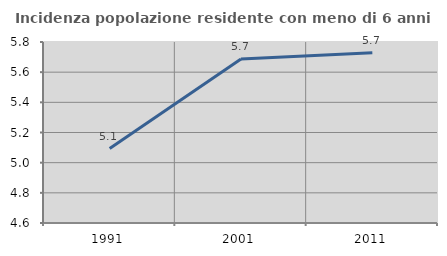
| Category | Incidenza popolazione residente con meno di 6 anni |
|---|---|
| 1991.0 | 5.093 |
| 2001.0 | 5.687 |
| 2011.0 | 5.729 |